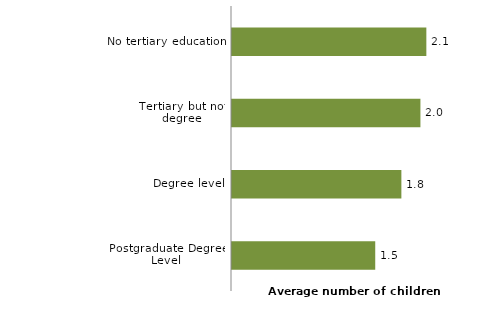
| Category | Series 0 |
|---|---|
| Postgraduate Degree Level | 1.537 |
| Degree level | 1.817 |
| Tertiary but not degree | 2.022 |
| No tertiary education | 2.085 |